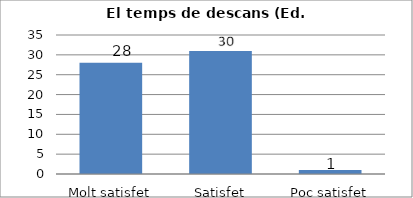
| Category | Series 0 |
|---|---|
| Molt satisfet | 28 |
| Satisfet | 31 |
| Poc satisfet | 1 |